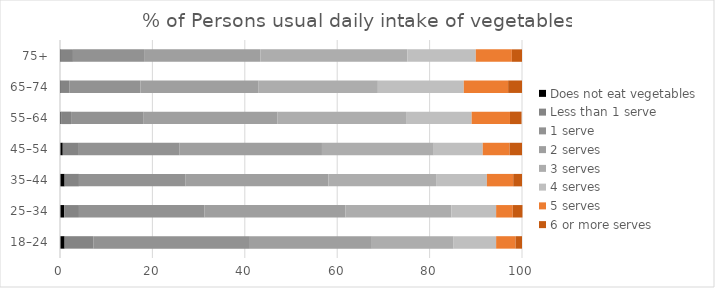
| Category | Does not eat vegetables | Less than 1 serve | 1 serve | 2 serves | 3 serves | 4 serves | 5 serves | 6 or more serves |
|---|---|---|---|---|---|---|---|---|
| 18–24 | 1 | 6.2 | 33.9 | 26.4 | 17.7 | 9.2 | 4.2 | 1.4 |
| 25–34 | 0.9 | 3.2 | 27.2 | 30.5 | 22.9 | 9.7 | 3.6 | 2.1 |
| 35–44 | 1 | 3.1 | 23.1 | 30.9 | 23.3 | 11 | 5.7 | 1.9 |
| 45–54 | 0.6 | 3.3 | 22 | 30.8 | 24.2 | 10.6 | 5.8 | 2.7 |
| 55–64 | 0.3 | 2.1 | 15.6 | 29.1 | 27.8 | 14.2 | 8.3 | 2.5 |
| 65–74 | 0.2 | 1.8 | 15.4 | 25.6 | 25.8 | 18.6 | 9.6 | 3 |
| 75+ | 0.2 | 2.6 | 15.4 | 25.2 | 31.8 | 14.8 | 7.8 | 2.2 |